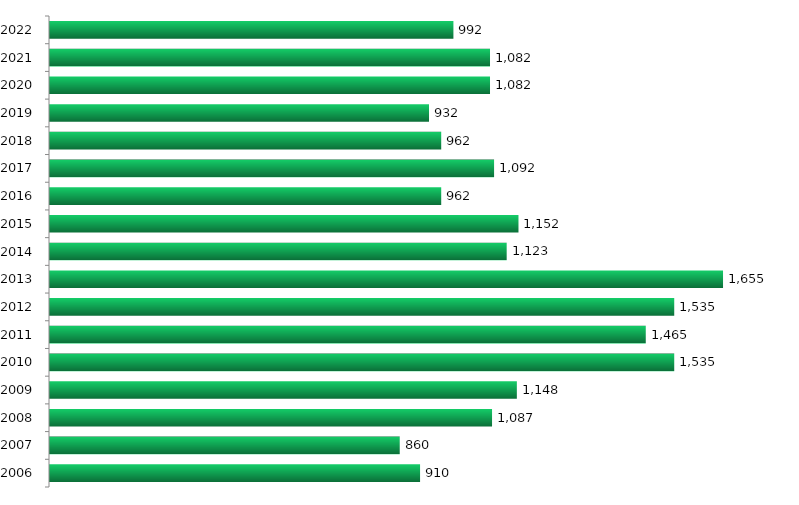
| Category | Vagas |
|---|---|
| 2006.0 | 910 |
| 2007.0 | 860 |
| 2008.0 | 1087 |
| 2009.0 | 1148 |
| 2010.0 | 1535 |
| 2011.0 | 1465 |
| 2012.0 | 1535 |
| 2013.0 | 1655 |
| 2014.0 | 1123 |
| 2015.0 | 1152 |
| 2016.0 | 962 |
| 2017.0 | 1092 |
| 2018.0 | 962 |
| 2019.0 | 932 |
| 2020.0 | 1082 |
| 2021.0 | 1082 |
| 2022.0 | 992 |